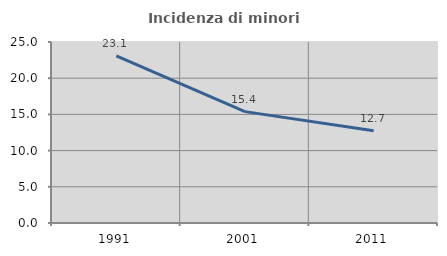
| Category | Incidenza di minori stranieri |
|---|---|
| 1991.0 | 23.077 |
| 2001.0 | 15.385 |
| 2011.0 | 12.736 |